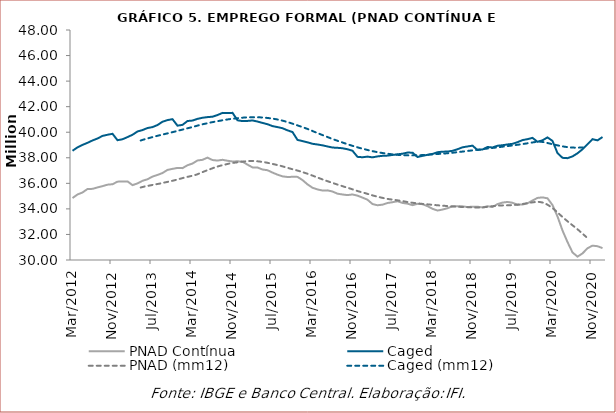
| Category | PNAD Contínua | Caged |
|---|---|---|
| 2012-03-01 | 34849000 | 38548765 |
| 2012-04-01 | 35127000 | 38812375 |
| 2012-05-01 | 35285000 | 39008149 |
| 2012-06-01 | 35557000 | 39171376 |
| 2012-07-01 | 35568000 | 39355372 |
| 2012-08-01 | 35680000 | 39508860 |
| 2012-09-01 | 35780000 | 39711199 |
| 2012-10-01 | 35895000 | 39801342 |
| 2012-11-01 | 35930000 | 39877499 |
| 2012-12-01 | 36131000 | 39374458 |
| 2013-01-01 | 36147000 | 39450072 |
| 2013-02-01 | 36151000 | 39618920 |
| 2013-03-01 | 35858000 | 39801938 |
| 2013-04-01 | 35994000 | 40058163 |
| 2013-05-01 | 36198000 | 40169387 |
| 2013-06-01 | 36319000 | 40327456 |
| 2013-07-01 | 36529000 | 40400673 |
| 2013-08-01 | 36656000 | 40562833 |
| 2013-09-01 | 36808000 | 40820501 |
| 2013-10-01 | 37051000 | 40951366 |
| 2013-11-01 | 37132000 | 41020727 |
| 2013-12-01 | 37208000 | 40513020 |
| 2014-01-01 | 37189000 | 40576258 |
| 2014-02-01 | 37416000 | 40877652 |
| 2014-03-01 | 37550000 | 40912757 |
| 2014-04-01 | 37789000 | 41045472 |
| 2014-05-01 | 37840000 | 41132144 |
| 2014-06-01 | 38012000 | 41182717 |
| 2014-07-01 | 37822000 | 41213900 |
| 2014-08-01 | 37781000 | 41344804 |
| 2014-09-01 | 37842000 | 41513630 |
| 2014-10-01 | 37767000 | 41496598 |
| 2014-11-01 | 37709000 | 41515946 |
| 2014-12-01 | 37724000 | 40933710 |
| 2015-01-01 | 37699000 | 40871885 |
| 2015-02-01 | 37462000 | 40885058 |
| 2015-03-01 | 37248000 | 40921123 |
| 2015-04-01 | 37239000 | 40836342 |
| 2015-05-01 | 37082000 | 40726978 |
| 2015-06-01 | 37027000 | 40628116 |
| 2015-07-01 | 36841000 | 40478759 |
| 2015-08-01 | 36678000 | 40401439 |
| 2015-09-01 | 36546000 | 40313684 |
| 2015-10-01 | 36497000 | 40147016 |
| 2015-11-01 | 36510000 | 40013114 |
| 2015-12-01 | 36505000 | 39398721 |
| 2016-01-01 | 36255000 | 39306448 |
| 2016-02-01 | 35920000 | 39210114 |
| 2016-03-01 | 35653000 | 39095592 |
| 2016-04-01 | 35522000 | 39039770 |
| 2016-05-01 | 35437000 | 38973384 |
| 2016-06-01 | 35449000 | 38885664 |
| 2016-07-01 | 35359000 | 38801424 |
| 2016-08-01 | 35190000 | 38779338 |
| 2016-09-01 | 35127000 | 38747069 |
| 2016-10-01 | 35079000 | 38668304 |
| 2016-11-01 | 35130000 | 38550270 |
| 2016-12-01 | 35035000 | 38072163 |
| 2017-01-01 | 34884000 | 38041088 |
| 2017-02-01 | 34717000 | 38090717 |
| 2017-03-01 | 34380000 | 38033123 |
| 2017-04-01 | 34285000 | 38107505 |
| 2017-05-01 | 34332000 | 38152350 |
| 2017-06-01 | 34461000 | 38169201 |
| 2017-07-01 | 34523000 | 38219982 |
| 2017-08-01 | 34598000 | 38269424 |
| 2017-09-01 | 34467000 | 38318707 |
| 2017-10-01 | 34409000 | 38405632 |
| 2017-11-01 | 34291000 | 38400831 |
| 2017-12-01 | 34396000 | 38060200 |
| 2018-01-01 | 34369000 | 38151267 |
| 2018-02-01 | 34213000 | 38228298 |
| 2018-03-01 | 34008000 | 38303416 |
| 2018-04-01 | 33872000 | 38434876 |
| 2018-05-01 | 33948000 | 38477938 |
| 2018-06-01 | 34053000 | 38486335 |
| 2018-07-01 | 34208000 | 38544480 |
| 2018-08-01 | 34212000 | 38668224 |
| 2018-09-01 | 34199000 | 38819230 |
| 2018-10-01 | 34143000 | 38885835 |
| 2018-11-01 | 34176000 | 38949003 |
| 2018-12-01 | 34170000 | 38606645 |
| 2019-01-01 | 34113000 | 38651311 |
| 2019-02-01 | 34210000 | 38843814 |
| 2019-03-01 | 34142000 | 38805202 |
| 2019-04-01 | 34375000 | 38941586 |
| 2019-05-01 | 34494000 | 38982260 |
| 2019-06-01 | 34542000 | 39041790 |
| 2019-07-01 | 34480000 | 39093415 |
| 2019-08-01 | 34324000 | 39221246 |
| 2019-09-01 | 34343000 | 39383280 |
| 2019-10-01 | 34435000 | 39457438 |
| 2019-11-01 | 34655000 | 39558035 |
| 2019-12-01 | 34859000 | 39250724 |
| 2020-01-01 | 34901000 | 39368517 |
| 2020-02-01 | 34827000 | 39593931 |
| 2020-03-01 | 34300000 | 39319840 |
| 2020-04-01 | 33408000 | 38365269 |
| 2020-05-01 | 32309000 | 37996469 |
| 2020-06-01 | 31405000 | 37969415 |
| 2020-07-01 | 30592000 | 38107550 |
| 2020-08-01 | 30263000 | 38350562 |
| 2020-09-01 | 30514000 | 38668071 |
| 2020-10-01 | 30920000 | 39059215 |
| 2020-11-01 | 31123000 | 39456790 |
| 2020-12-01 | 31079000 | 39363064 |
| 2021-01-01 | 30932000 | 39623417 |